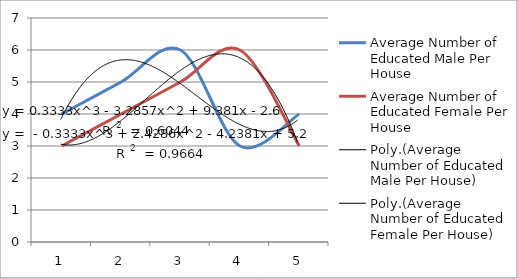
| Category | Average Number of Educated Male Per House | Average Number of Educated Female Per House |
|---|---|---|
| 0 | 4 | 3 |
| 1 | 5 | 4 |
| 2 | 6 | 5 |
| 3 | 3 | 6 |
| 4 | 4 | 3 |